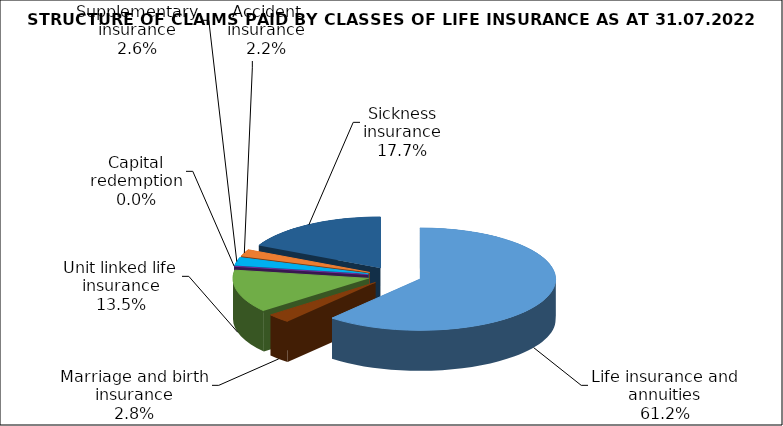
| Category | Series 0 |
|---|---|
| Life insurance and annuities | 92002206.956 |
| Marriage and birth insurance | 4262801.838 |
| Unit linked life insurance | 20319377.795 |
| Capital redemption | 0 |
| Supplementary insurance | 3835458.883 |
| Accident insurance | 3309360.281 |
| Sickness insurance | 26571265.212 |